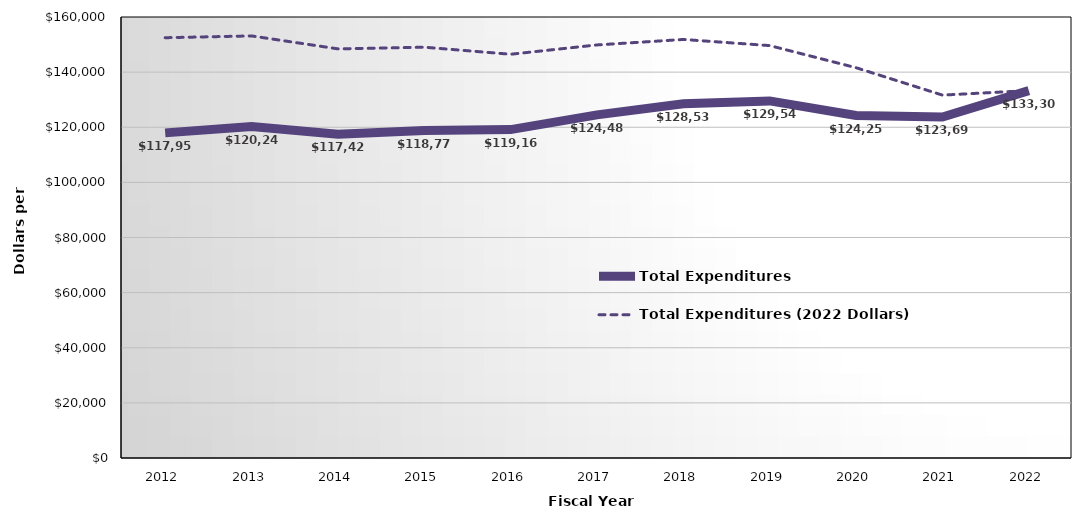
| Category | Total Expenditures | Total Expenditures (2022 Dollars) |
|---|---|---|
| 2012.0 | 117959 | 152486.862 |
| 2013.0 | 120248 | 153137.453 |
| 2014.0 | 117425 | 148437.41 |
| 2015.0 | 118778 | 149043.393 |
| 2016.0 | 119160 | 146483.508 |
| 2017.0 | 124487 | 149866.644 |
| 2018.0 | 128535 | 151852.352 |
| 2019.0 | 129549 | 149623.804 |
| 2020.0 | 124258 | 141597.707 |
| 2021.0 | 123690 | 131661.009 |
| 2022.0 | 133305 | 133305 |